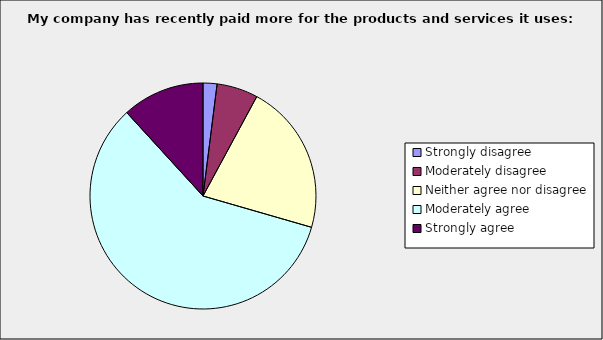
| Category | Series 0 |
|---|---|
| Strongly disagree | 0.02 |
| Moderately disagree | 0.059 |
| Neither agree nor disagree | 0.216 |
| Moderately agree | 0.588 |
| Strongly agree | 0.118 |